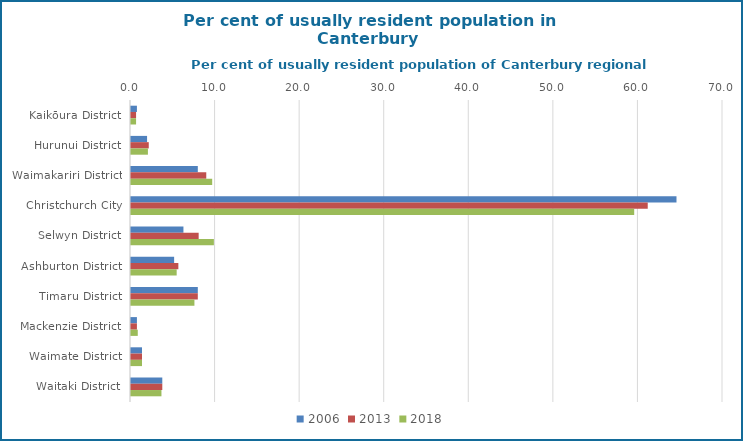
| Category | 2006 | 2013 | 2018 |
|---|---|---|---|
| Kaikōura District | 0.7 | 0.6 | 0.6 |
| Hurunui District | 1.9 | 2.1 | 2 |
| Waimakariri District | 7.9 | 8.9 | 9.6 |
| Christchurch City | 64.5 | 61.1 | 59.5 |
| Selwyn District | 6.2 | 8 | 9.8 |
| Ashburton District | 5.1 | 5.6 | 5.4 |
| Timaru District | 7.9 | 7.9 | 7.5 |
| Mackenzie District | 0.7 | 0.7 | 0.8 |
| Waimate District | 1.3 | 1.3 | 1.3 |
| Waitaki District | 3.7 | 3.7 | 3.6 |